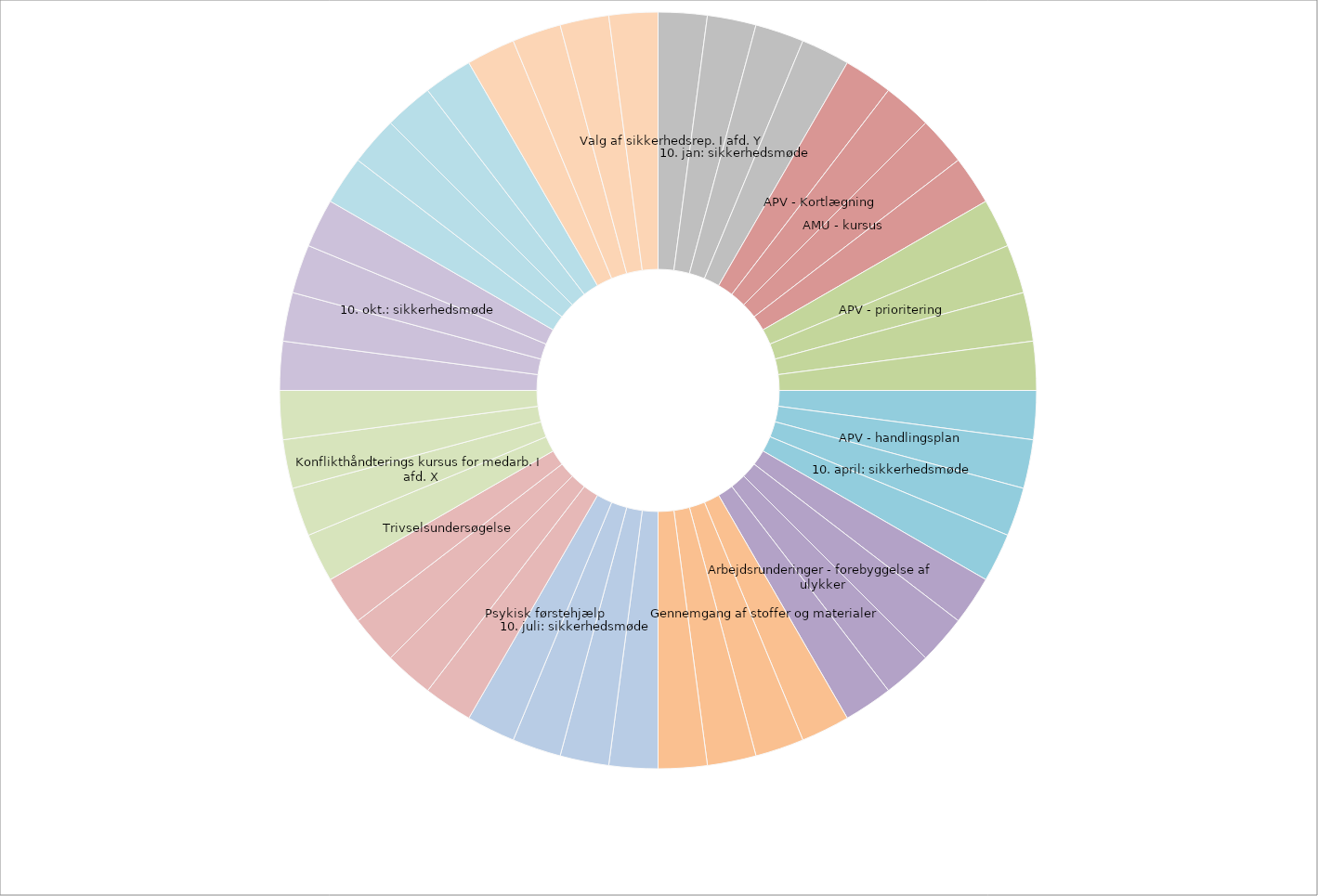
| Category | Series 0 |
|---|---|
| Valg af sikkerhedsrep. I afd. Y | 10 |
|  | 10 |
| 10. jan: sikkerhedsmøde | 10 |
|  | 10 |
|  | 10 |
| APV - Kortlægning | 10 |
| AMU - kursus | 10 |
|  | 10 |
|  | 10 |
| APV - prioritering | 10 |
|  | 10 |
|  | 10 |
|  | 10 |
| APV - handlingsplan | 10 |
| 10. april: sikkerhedsmøde | 10 |
|  | 10 |
|   | 10 |
|  | 10 |
| Arbejdsrunderinger - forebyggelse af ulykker | 10 |
|  | 10 |
| Gennemgang af stoffer og materialer | 10 |
|  | 10 |
|  | 10 |
|  | 10 |
|  | 10 |
|  | 10 |
| 10. juli: sikkerhedsmøde | 10 |
| Psykisk førstehjælp | 10 |
|  | 10 |
|  | 10 |
|  | 10 |
| Trivselsundersøgelse | 10 |
|  | 10 |
| Konflikthåndterings kursus for medarb. I afd. X | 10 |
|  | 10 |
|  | 10 |
|  | 10 |
|  | 10 |
| 10. okt.: sikkerhedsmøde | 10 |